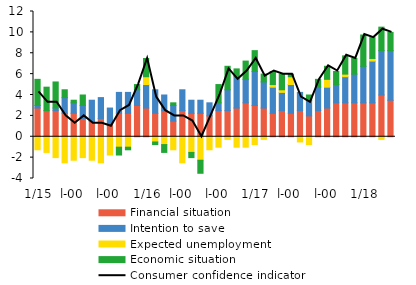
| Category | Financial situation | Intention to save | Expected unemployment | Economic situation |
|---|---|---|---|---|
| 0 | 2.75 | 0.25 | -1.25 | 2.5 |
| 1900-01-01 | 2.5 | 0 | -1.5 | 2.25 |
| 1900-01-02 | 2.5 | 0.25 | -2 | 2.5 |
| 1900-01-03 | 2.25 | 1.5 | -2.5 | 0.75 |
| 1900-01-04 | 2.25 | 1 | -2.25 | 0.25 |
| 1900-01-05 | 1.75 | 1.25 | -2 | 1 |
| 1900-01-06 | 1.5 | 2 | -2.25 | 0 |
| 1900-01-07 | 1.75 | 2 | -2.5 | 0 |
| 1900-01-08 | 1.25 | 1.5 | -1.75 | 0 |
| 1900-01-09 | 2.25 | 2 | -1 | -0.75 |
| 1900-01-10 | 2.25 | 2 | -1 | -0.25 |
| 1900-01-11 | 3 | 1.5 | 0 | 0.5 |
| 1900-01-12 | 2.75 | 2.25 | 0.75 | 1.75 |
| 1900-01-13 | 2.25 | 2.25 | -0.5 | -0.25 |
| 1900-01-14 | 2.5 | 1.5 | -0.75 | -0.75 |
| 1900-01-15 | 1.5 | 1.5 | -1.25 | 0.25 |
| 1900-01-16 | 2.5 | 2 | -2.5 | 0 |
| 1900-01-17 | 2.25 | 1.25 | -1.5 | -0.5 |
| 1900-01-18 | 2.25 | 1.25 | -2.25 | -1.25 |
| 1900-01-19 | 2 | 1.25 | -1.25 | 0 |
| 1900-01-20 | 2.5 | 0.75 | -1 | 1.75 |
| 1900-01-21 | 2.5 | 2 | -0.25 | 2.25 |
| 1900-01-22 | 2.75 | 3 | -1 | 0.75 |
| 1900-01-23 | 3.25 | 2.25 | -1 | 1.75 |
| 1900-01-24 | 3 | 3.25 | -0.75 | 2 |
| 1900-01-25 | 2.75 | 2.5 | -0.25 | 0.75 |
| 1900-01-26 | 2.25 | 2.5 | 0.25 | 1.25 |
| 1900-01-27 | 2.5 | 1.75 | 0.25 | 1.5 |
| 1900-01-28 | 2.25 | 2.75 | 0.75 | 0.25 |
| 1900-01-29 | 2.5 | 1.75 | -0.5 | 0 |
| 1900-01-30 | 2 | 1.5 | -0.75 | 0.5 |
| 1900-01-31 | 2.5 | 2.25 | 0 | 0.75 |
| 1900-02-01 | 2.75 | 2 | 0.75 | 1.25 |
| 1900-02-02 | 3.25 | 1.75 | 0 | 1.25 |
| 1900-02-03 | 3.25 | 2.5 | 0.25 | 1.75 |
| 1900-02-04 | 3.25 | 2.75 | 0 | 1.5 |
| 1900-02-05 | 3.25 | 3.5 | 0 | 3 |
| 1900-02-06 | 3.25 | 4 | 0.25 | 2 |
| 1900-02-07 | 4 | 4.25 | -0.25 | 2.25 |
| 1900-02-08 | 3.5 | 4.75 | 0 | 1.75 |